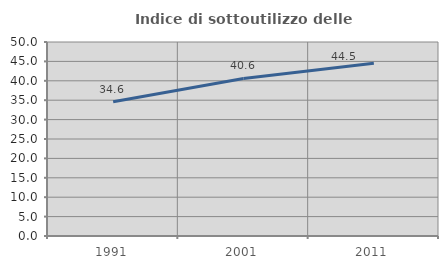
| Category | Indice di sottoutilizzo delle abitazioni  |
|---|---|
| 1991.0 | 34.611 |
| 2001.0 | 40.593 |
| 2011.0 | 44.504 |